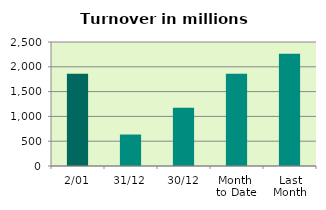
| Category | Series 0 |
|---|---|
| 2/01 | 1857.708 |
| 31/12 | 634.603 |
| 30/12 | 1174.271 |
| Month 
to Date | 1857.708 |
| Last
Month | 2262.611 |